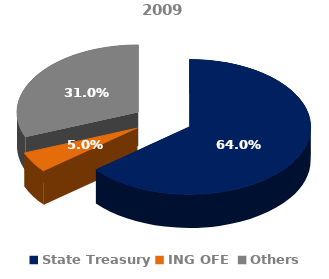
| Category | 2009 |
|---|---|
| State Treasury | 0.64 |
| ING OFE | 0.05 |
| Others | 0.31 |